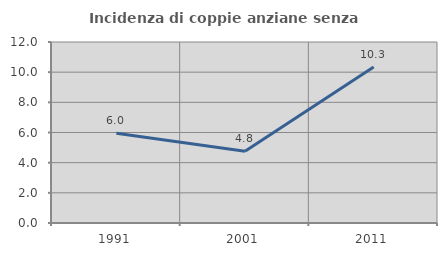
| Category | Incidenza di coppie anziane senza figli  |
|---|---|
| 1991.0 | 5.952 |
| 2001.0 | 4.762 |
| 2011.0 | 10.345 |